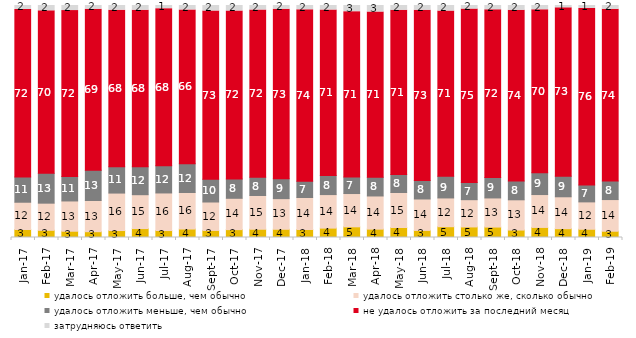
| Category | удалось отложить больше, чем обычно | удалось отложить столько же, сколько обычно | удалось отложить меньше, чем обычно | не удалось отложить за последний месяц | затрудняюсь ответить |
|---|---|---|---|---|---|
| 2017-01-01 | 3.45 | 11.75 | 10.9 | 72.2 | 1.7 |
| 2017-02-01 | 3.1 | 11.7 | 12.85 | 70.05 | 2.3 |
| 2017-03-01 | 2.7 | 13.05 | 10.55 | 71.5 | 2.2 |
| 2017-04-01 | 2.5 | 13.45 | 13 | 69.4 | 1.6 |
| 2017-05-01 | 3 | 16.15 | 11.35 | 67.5 | 2 |
| 2017-06-01 | 3.85 | 14.6 | 12 | 67.5 | 2.05 |
| 2017-07-01 | 3 | 16.2 | 11.75 | 67.7 | 1.35 |
| 2017-08-01 | 3.65 | 15.75 | 12.4 | 66.3 | 1.9 |
| 2017-09-01 | 3.05 | 12.25 | 9.8 | 72.55 | 2.35 |
| 2017-10-01 | 3.4 | 13.5 | 8.3 | 72.45 | 2.35 |
| 2017-11-01 | 3.55 | 14.55 | 7.85 | 72.05 | 1.95 |
| 2017-12-01 | 3.55 | 13.2 | 8.55 | 73.1 | 1.6 |
| 2018-01-01 | 3.45 | 13.8 | 7 | 73.9 | 1.85 |
| 2018-02-01 | 4.05 | 14.45 | 8.25 | 71.3 | 1.95 |
| 2018-03-01 | 4.6 | 14.35 | 7.1 | 71.3 | 2.65 |
| 2018-04-01 | 3.6 | 14.3 | 8.05 | 71.25 | 2.8 |
| 2018-05-01 | 4.3 | 15.1 | 7.75 | 70.75 | 2.1 |
| 2018-06-01 | 3.05 | 13.55 | 7.95 | 73.4 | 2.05 |
| 2018-07-01 | 4.65 | 12.4 | 9.35 | 71.2 | 2.4 |
| 2018-08-01 | 4.55 | 11.75 | 7.45 | 74.7 | 1.55 |
| 2018-09-01 | 4.5 | 12.55 | 8.8 | 72.3 | 1.85 |
| 2018-10-01 | 3.2 | 13.05 | 8.05 | 73.6 | 2.1 |
| 2018-11-01 | 4.341 | 14.172 | 9.381 | 70.259 | 1.846 |
| 2018-12-01 | 3.8 | 13.75 | 8.9 | 72.55 | 1 |
| 2019-01-01 | 3.55 | 11.8 | 7.25 | 76.1 | 1.3 |
| 2019-02-01 | 2.7 | 13.65 | 7.95 | 74.05 | 1.65 |